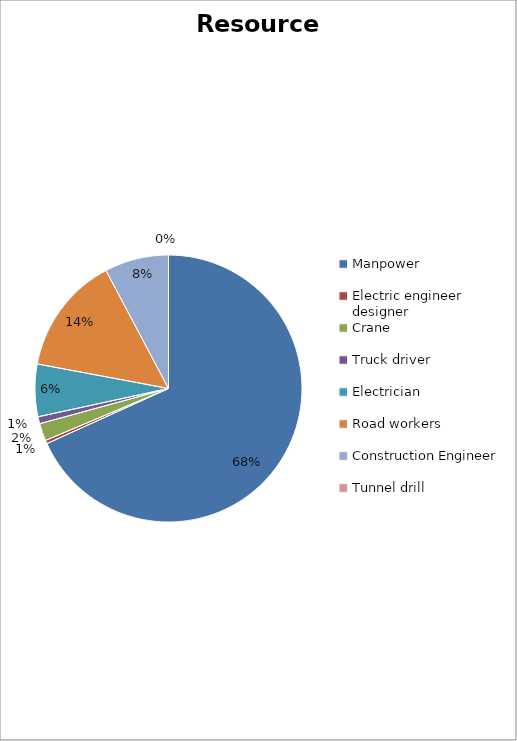
| Category | data |
|---|---|
| Manpower | 13556000 |
| Electric engineer designer | 81920 |
| Crane | 419520 |
| Truck driver | 168960 |
| Electrician | 1260420 |
| Road workers | 2841600 |
| Construction Engineer | 1540800 |
| Tunnel drill | 0 |